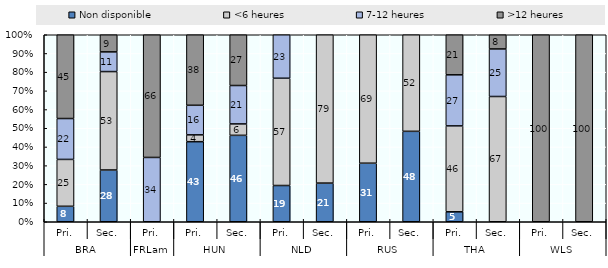
| Category | Non disponible | <6 heures | 7-12 heures | >12 heures |
|---|---|---|---|---|
| 0 | 8.267 | 25.067 | 21.867 | 44.8 |
| 1 | 27.68 | 52.632 | 10.526 | 9.162 |
| 2 | 0 | 0 | 34.392 | 65.608 |
| 3 | 42.822 | 3.65 | 15.815 | 37.713 |
| 4 | 46.21 | 6.112 | 20.538 | 27.139 |
| 5 | 19.38 | 57.364 | 23.256 | 0 |
| 6 | 20.678 | 79.322 | 0 | 0 |
| 7 | 31.313 | 68.687 | 0 | 0 |
| 8 | 48.356 | 51.644 | 0 | 0 |
| 9 | 5.322 | 45.938 | 27.311 | 21.429 |
| 10 | 0 | 66.985 | 25.422 | 7.593 |
| 11 | 0 | 0 | 0 | 100 |
| 12 | 0 | 0 | 0 | 100 |